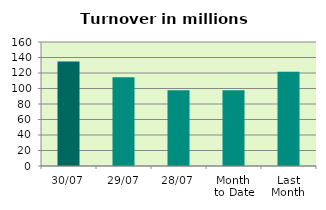
| Category | Series 0 |
|---|---|
| 30/07 | 134.773 |
| 29/07 | 114.497 |
| 28/07 | 97.9 |
| Month 
to Date | 97.692 |
| Last
Month | 121.74 |